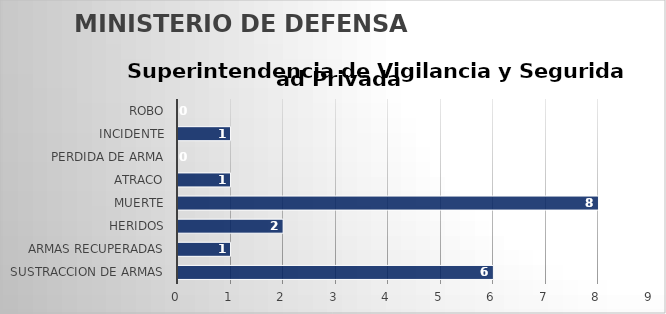
| Category | Series 1 |
|---|---|
| SUSTRACCION DE ARMAS | 6 |
| ARMAS RECUPERADAS | 1 |
| HERIDOS | 2 |
| MUERTE | 8 |
| ATRACO | 1 |
| PERDIDA DE ARMA | 0 |
| INCIDENTE | 1 |
| ROBO | 0 |